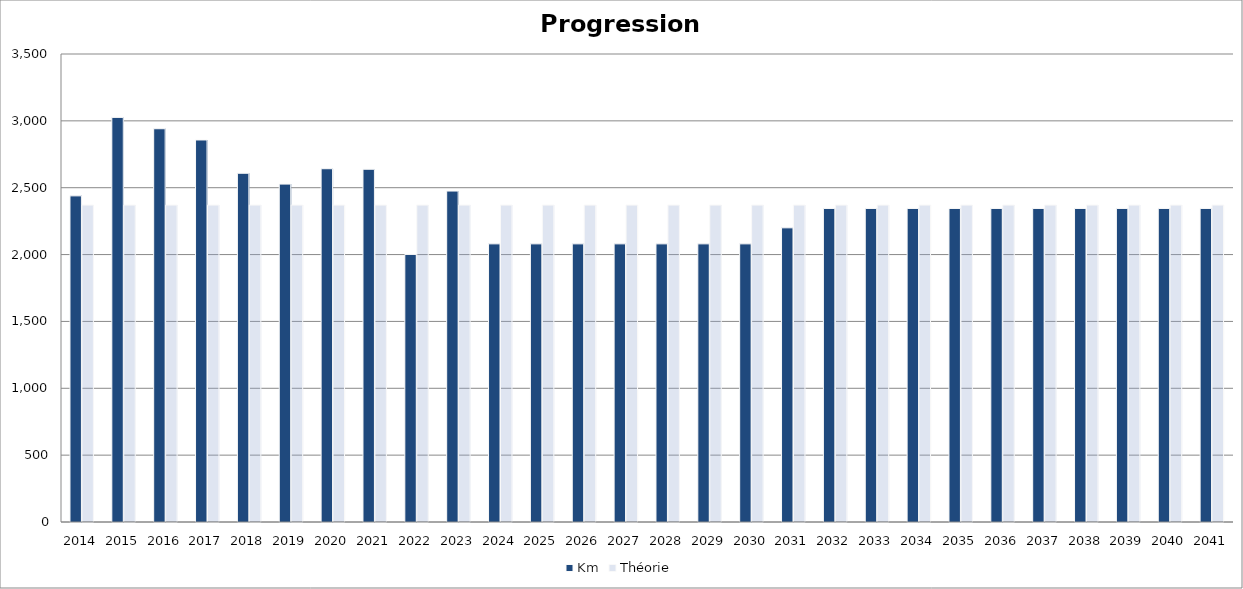
| Category | Km | Théorie |
|---|---|---|
| 2014.0 | 2439 | 2370.107 |
| 2015.0 | 3026 | 2370.107 |
| 2016.0 | 2941 | 2370.107 |
| 2017.0 | 2857 | 2370.107 |
| 2018.0 | 2608 | 2370.107 |
| 2019.0 | 2527 | 2370.107 |
| 2020.0 | 2642 | 2370.107 |
| 2021.0 | 2638 | 2370.107 |
| 2022.0 | 2001 | 2370.107 |
| 2023.0 | 2475 | 2370.107 |
| 2024.0 | 2080 | 2370.107 |
| 2025.0 | 2080 | 2370.107 |
| 2026.0 | 2080 | 2370.107 |
| 2027.0 | 2080 | 2370.107 |
| 2028.0 | 2080 | 2370.107 |
| 2029.0 | 2080 | 2370.107 |
| 2030.0 | 2080 | 2370.107 |
| 2031.0 | 2200 | 2370.107 |
| 2032.0 | 2344.9 | 2370.107 |
| 2033.0 | 2344.9 | 2370.107 |
| 2034.0 | 2344.9 | 2370.107 |
| 2035.0 | 2344.9 | 2370.107 |
| 2036.0 | 2344.9 | 2370.107 |
| 2037.0 | 2344.9 | 2370.107 |
| 2038.0 | 2344.9 | 2370.107 |
| 2039.0 | 2344.9 | 2370.107 |
| 2040.0 | 2344.9 | 2370.107 |
| 2041.0 | 2344.9 | 2370.107 |